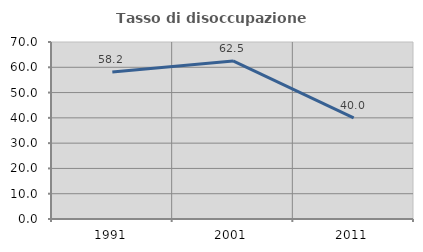
| Category | Tasso di disoccupazione giovanile  |
|---|---|
| 1991.0 | 58.163 |
| 2001.0 | 62.5 |
| 2011.0 | 40 |